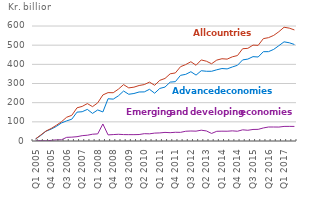
| Category | Advanced economies | Emerging and developing economies | All countries |
|---|---|---|---|
| Q1 2005 | 10.6 | 0.3 | 10.9 |
| Q2 2005 | 29 | 2.3 | 31.3 |
| Q3 2005 | 51 | 0.9 | 51.9 |
| Q4 2005 | 61.9 | 3.2 | 65.1 |
| Q1 2006 | 76 | 5.9 | 81.9 |
| Q2 2006 | 94.1 | 6.4 | 100.5 |
| Q3 2006 | 104.9 | 19 | 123.9 |
| Q4 2006 | 113.9 | 20.2 | 134.1 |
| Q1 2007 | 150.6 | 22.5 | 173.1 |
| Q2 2007 | 152.7 | 27.8 | 180.5 |
| Q3 2007 | 165 | 30.2 | 195.2 |
| Q4 2007 | 144 | 35.3 | 179.3 |
| Q1 2008 | 162 | 37.1 | 199 |
| Q2 2008 | 151.6 | 88.8 | 240.4 |
| Q3 2008 | 220.5 | 31.9 | 252.4 |
| Q4 2008 | 218.4 | 33.5 | 251.9 |
| Q1 2006 | 235.6 | 35 | 270.6 |
| Q2 2009 | 260.7 | 33.5 | 294.2 |
| Q3 2009 | 243.9 | 33.2 | 277.1 |
| Q4 2009 | 247.8 | 33.1 | 280.9 |
| Q1 2010 | 255.7 | 33.7 | 289.5 |
| Q2 2010 | 256.2 | 38.2 | 294.4 |
| Q3 2010 | 269.7 | 37.5 | 307.3 |
| Q4 2010 | 249.3 | 41.2 | 290.6 |
| Q1 2011 | 274.4 | 42.2 | 316.6 |
| Q2 2011 | 281.4 | 44.9 | 326.3 |
| Q3 2011 | 307.2 | 43.4 | 350.6 |
| Q4 2011 | 309.6 | 45.5 | 355.1 |
| Q1 2012 | 342.6 | 45.1 | 387.7 |
| Q2 2012 | 347.7 | 50.9 | 398.7 |
| Q3 2012 | 361.5 | 52.1 | 413.6 |
| Q4 2012 | 343.8 | 51.4 | 395.2 |
| Q1 2013 | 366.7 | 56.4 | 423 |
| Q2 2013 | 363.8 | 52.5 | 416.2 |
| Q3 2013 | 363.7 | 39.4 | 403 |
| Q4 2013 | 371.5 | 50.6 | 422.1 |
| Q1 2014 | 378.1 | 51.2 | 429.2 |
| Q2 2014 | 376.1 | 51 | 427.1 |
| Q3 2014 | 386.2 | 52.9 | 439.1 |
| Q4 2014 | 395 | 50.9 | 445.9 |
| Q1 2015 | 423.1 | 58.3 | 481.4 |
| Q2 2015 | 427.4 | 56 | 483.4 |
| Q3 2015 | 440.1 | 60.2 | 500.3 |
| Q4 2015 | 438.2 | 60.8 | 499 |
| Q1 2016 | 465.9 | 68.1 | 534.1 |
| Q2 2016 | 466.2 | 73 | 539.2 |
| Q3 2016 | 478 | 73 | 551 |
| Q4 2016 | 497.5 | 72.7 | 570.3 |
| Q1 2017 | 517.4 | 76.1 | 593.5 |
| Q2 2017 | 512.6 | 76.3 | 588.9 |
| Q3 2017 | 503.5 | 76 | 579.5 |